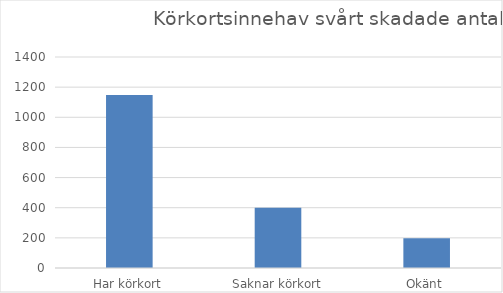
| Category | Antal |
|---|---|
| Har körkort | 1148 |
| Saknar körkort | 399 |
| Okänt | 198 |